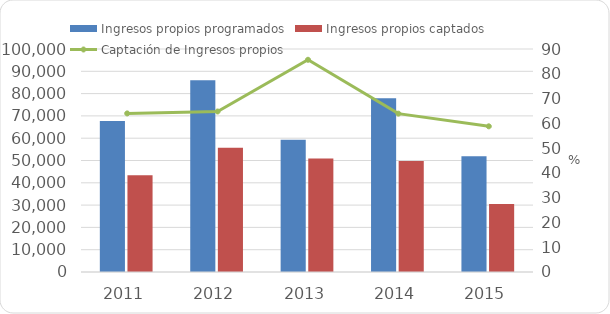
| Category | Ingresos propios programados | Ingresos propios captados  |
|---|---|---|
| 2011 | 67737 | 43352 |
| 2012 | 86014.6 | 55717.433 |
| 2013 | 59356.6 | 50840.892 |
| 2014 | 77937 | 49810.516 |
| 2015 | 51955.052 | 30547.6 |